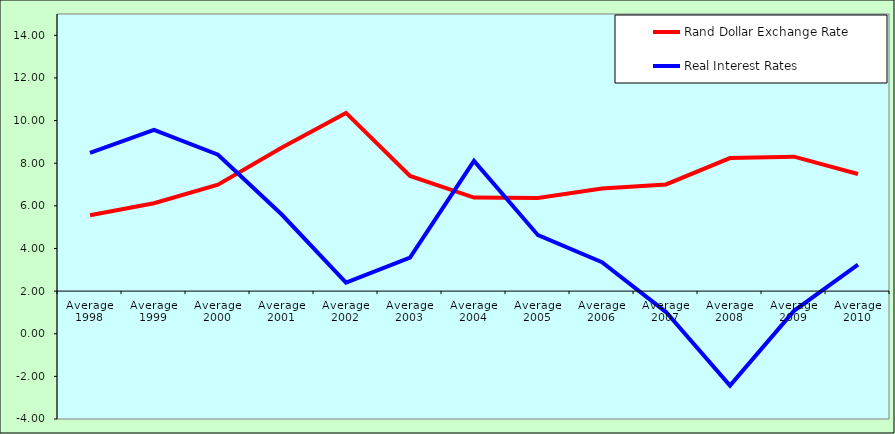
| Category | Rand Dollar Exchange Rate | Real Interest Rates |
|---|---|---|
| Average 1998 | 5.555 | 8.489 |
| Average 1999 | 6.122 | 9.567 |
| Average 2000 | 6.996 | 8.397 |
| Average 2001 | 8.737 | 5.581 |
| Average 2002 | 10.361 | 2.398 |
| Average 2003 | 7.404 | 3.575 |
| Average 2004 | 6.388 | 8.108 |
| Average 2005 | 6.367 | 4.622 |
| Average 2006 | 6.812 | 3.359 |
| Average 2007 | 7.005 | 1.017 |
| Average 2008 | 8.24 | -2.432 |
| Average 2009 | 8.308 | 1.074 |
| Average 2010 | 7.493 | 3.242 |